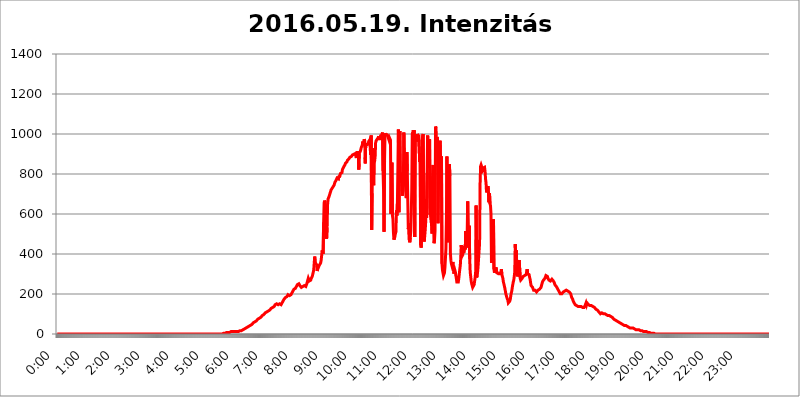
| Category | 2016.05.19. Intenzitás [W/m^2] |
|---|---|
| 0.0 | 0 |
| 0.0006944444444444445 | 0 |
| 0.001388888888888889 | 0 |
| 0.0020833333333333333 | 0 |
| 0.002777777777777778 | 0 |
| 0.003472222222222222 | 0 |
| 0.004166666666666667 | 0 |
| 0.004861111111111111 | 0 |
| 0.005555555555555556 | 0 |
| 0.0062499999999999995 | 0 |
| 0.006944444444444444 | 0 |
| 0.007638888888888889 | 0 |
| 0.008333333333333333 | 0 |
| 0.009027777777777779 | 0 |
| 0.009722222222222222 | 0 |
| 0.010416666666666666 | 0 |
| 0.011111111111111112 | 0 |
| 0.011805555555555555 | 0 |
| 0.012499999999999999 | 0 |
| 0.013194444444444444 | 0 |
| 0.013888888888888888 | 0 |
| 0.014583333333333332 | 0 |
| 0.015277777777777777 | 0 |
| 0.015972222222222224 | 0 |
| 0.016666666666666666 | 0 |
| 0.017361111111111112 | 0 |
| 0.018055555555555557 | 0 |
| 0.01875 | 0 |
| 0.019444444444444445 | 0 |
| 0.02013888888888889 | 0 |
| 0.020833333333333332 | 0 |
| 0.02152777777777778 | 0 |
| 0.022222222222222223 | 0 |
| 0.02291666666666667 | 0 |
| 0.02361111111111111 | 0 |
| 0.024305555555555556 | 0 |
| 0.024999999999999998 | 0 |
| 0.025694444444444447 | 0 |
| 0.02638888888888889 | 0 |
| 0.027083333333333334 | 0 |
| 0.027777777777777776 | 0 |
| 0.02847222222222222 | 0 |
| 0.029166666666666664 | 0 |
| 0.029861111111111113 | 0 |
| 0.030555555555555555 | 0 |
| 0.03125 | 0 |
| 0.03194444444444445 | 0 |
| 0.03263888888888889 | 0 |
| 0.03333333333333333 | 0 |
| 0.034027777777777775 | 0 |
| 0.034722222222222224 | 0 |
| 0.035416666666666666 | 0 |
| 0.036111111111111115 | 0 |
| 0.03680555555555556 | 0 |
| 0.0375 | 0 |
| 0.03819444444444444 | 0 |
| 0.03888888888888889 | 0 |
| 0.03958333333333333 | 0 |
| 0.04027777777777778 | 0 |
| 0.04097222222222222 | 0 |
| 0.041666666666666664 | 0 |
| 0.042361111111111106 | 0 |
| 0.04305555555555556 | 0 |
| 0.043750000000000004 | 0 |
| 0.044444444444444446 | 0 |
| 0.04513888888888889 | 0 |
| 0.04583333333333334 | 0 |
| 0.04652777777777778 | 0 |
| 0.04722222222222222 | 0 |
| 0.04791666666666666 | 0 |
| 0.04861111111111111 | 0 |
| 0.049305555555555554 | 0 |
| 0.049999999999999996 | 0 |
| 0.05069444444444445 | 0 |
| 0.051388888888888894 | 0 |
| 0.052083333333333336 | 0 |
| 0.05277777777777778 | 0 |
| 0.05347222222222222 | 0 |
| 0.05416666666666667 | 0 |
| 0.05486111111111111 | 0 |
| 0.05555555555555555 | 0 |
| 0.05625 | 0 |
| 0.05694444444444444 | 0 |
| 0.057638888888888885 | 0 |
| 0.05833333333333333 | 0 |
| 0.05902777777777778 | 0 |
| 0.059722222222222225 | 0 |
| 0.06041666666666667 | 0 |
| 0.061111111111111116 | 0 |
| 0.06180555555555556 | 0 |
| 0.0625 | 0 |
| 0.06319444444444444 | 0 |
| 0.06388888888888888 | 0 |
| 0.06458333333333334 | 0 |
| 0.06527777777777778 | 0 |
| 0.06597222222222222 | 0 |
| 0.06666666666666667 | 0 |
| 0.06736111111111111 | 0 |
| 0.06805555555555555 | 0 |
| 0.06874999999999999 | 0 |
| 0.06944444444444443 | 0 |
| 0.07013888888888889 | 0 |
| 0.07083333333333333 | 0 |
| 0.07152777777777779 | 0 |
| 0.07222222222222223 | 0 |
| 0.07291666666666667 | 0 |
| 0.07361111111111111 | 0 |
| 0.07430555555555556 | 0 |
| 0.075 | 0 |
| 0.07569444444444444 | 0 |
| 0.0763888888888889 | 0 |
| 0.07708333333333334 | 0 |
| 0.07777777777777778 | 0 |
| 0.07847222222222222 | 0 |
| 0.07916666666666666 | 0 |
| 0.0798611111111111 | 0 |
| 0.08055555555555556 | 0 |
| 0.08125 | 0 |
| 0.08194444444444444 | 0 |
| 0.08263888888888889 | 0 |
| 0.08333333333333333 | 0 |
| 0.08402777777777777 | 0 |
| 0.08472222222222221 | 0 |
| 0.08541666666666665 | 0 |
| 0.08611111111111112 | 0 |
| 0.08680555555555557 | 0 |
| 0.08750000000000001 | 0 |
| 0.08819444444444445 | 0 |
| 0.08888888888888889 | 0 |
| 0.08958333333333333 | 0 |
| 0.09027777777777778 | 0 |
| 0.09097222222222222 | 0 |
| 0.09166666666666667 | 0 |
| 0.09236111111111112 | 0 |
| 0.09305555555555556 | 0 |
| 0.09375 | 0 |
| 0.09444444444444444 | 0 |
| 0.09513888888888888 | 0 |
| 0.09583333333333333 | 0 |
| 0.09652777777777777 | 0 |
| 0.09722222222222222 | 0 |
| 0.09791666666666667 | 0 |
| 0.09861111111111111 | 0 |
| 0.09930555555555555 | 0 |
| 0.09999999999999999 | 0 |
| 0.10069444444444443 | 0 |
| 0.1013888888888889 | 0 |
| 0.10208333333333335 | 0 |
| 0.10277777777777779 | 0 |
| 0.10347222222222223 | 0 |
| 0.10416666666666667 | 0 |
| 0.10486111111111111 | 0 |
| 0.10555555555555556 | 0 |
| 0.10625 | 0 |
| 0.10694444444444444 | 0 |
| 0.1076388888888889 | 0 |
| 0.10833333333333334 | 0 |
| 0.10902777777777778 | 0 |
| 0.10972222222222222 | 0 |
| 0.1111111111111111 | 0 |
| 0.11180555555555556 | 0 |
| 0.11180555555555556 | 0 |
| 0.1125 | 0 |
| 0.11319444444444444 | 0 |
| 0.11388888888888889 | 0 |
| 0.11458333333333333 | 0 |
| 0.11527777777777777 | 0 |
| 0.11597222222222221 | 0 |
| 0.11666666666666665 | 0 |
| 0.1173611111111111 | 0 |
| 0.11805555555555557 | 0 |
| 0.11944444444444445 | 0 |
| 0.12013888888888889 | 0 |
| 0.12083333333333333 | 0 |
| 0.12152777777777778 | 0 |
| 0.12222222222222223 | 0 |
| 0.12291666666666667 | 0 |
| 0.12291666666666667 | 0 |
| 0.12361111111111112 | 0 |
| 0.12430555555555556 | 0 |
| 0.125 | 0 |
| 0.12569444444444444 | 0 |
| 0.12638888888888888 | 0 |
| 0.12708333333333333 | 0 |
| 0.16875 | 0 |
| 0.12847222222222224 | 0 |
| 0.12916666666666668 | 0 |
| 0.12986111111111112 | 0 |
| 0.13055555555555556 | 0 |
| 0.13125 | 0 |
| 0.13194444444444445 | 0 |
| 0.1326388888888889 | 0 |
| 0.13333333333333333 | 0 |
| 0.13402777777777777 | 0 |
| 0.13402777777777777 | 0 |
| 0.13472222222222222 | 0 |
| 0.13541666666666666 | 0 |
| 0.1361111111111111 | 0 |
| 0.13749999999999998 | 0 |
| 0.13819444444444443 | 0 |
| 0.1388888888888889 | 0 |
| 0.13958333333333334 | 0 |
| 0.14027777777777778 | 0 |
| 0.14097222222222222 | 0 |
| 0.14166666666666666 | 0 |
| 0.1423611111111111 | 0 |
| 0.14305555555555557 | 0 |
| 0.14375000000000002 | 0 |
| 0.14444444444444446 | 0 |
| 0.1451388888888889 | 0 |
| 0.1451388888888889 | 0 |
| 0.14652777777777778 | 0 |
| 0.14722222222222223 | 0 |
| 0.14791666666666667 | 0 |
| 0.1486111111111111 | 0 |
| 0.14930555555555555 | 0 |
| 0.15 | 0 |
| 0.15069444444444444 | 0 |
| 0.15138888888888888 | 0 |
| 0.15208333333333332 | 0 |
| 0.15277777777777776 | 0 |
| 0.15347222222222223 | 0 |
| 0.15416666666666667 | 0 |
| 0.15486111111111112 | 0 |
| 0.15555555555555556 | 0 |
| 0.15625 | 0 |
| 0.15694444444444444 | 0 |
| 0.15763888888888888 | 0 |
| 0.15833333333333333 | 0 |
| 0.15902777777777777 | 0 |
| 0.15972222222222224 | 0 |
| 0.16041666666666668 | 0 |
| 0.16111111111111112 | 0 |
| 0.16180555555555556 | 0 |
| 0.1625 | 0 |
| 0.16319444444444445 | 0 |
| 0.1638888888888889 | 0 |
| 0.16458333333333333 | 0 |
| 0.16527777777777777 | 0 |
| 0.16597222222222222 | 0 |
| 0.16666666666666666 | 0 |
| 0.1673611111111111 | 0 |
| 0.16805555555555554 | 0 |
| 0.16874999999999998 | 0 |
| 0.16944444444444443 | 0 |
| 0.17013888888888887 | 0 |
| 0.1708333333333333 | 0 |
| 0.17152777777777775 | 0 |
| 0.17222222222222225 | 0 |
| 0.1729166666666667 | 0 |
| 0.17361111111111113 | 0 |
| 0.17430555555555557 | 0 |
| 0.17500000000000002 | 0 |
| 0.17569444444444446 | 0 |
| 0.1763888888888889 | 0 |
| 0.17708333333333334 | 0 |
| 0.17777777777777778 | 0 |
| 0.17847222222222223 | 0 |
| 0.17916666666666667 | 0 |
| 0.1798611111111111 | 0 |
| 0.18055555555555555 | 0 |
| 0.18125 | 0 |
| 0.18194444444444444 | 0 |
| 0.1826388888888889 | 0 |
| 0.18333333333333335 | 0 |
| 0.1840277777777778 | 0 |
| 0.18472222222222223 | 0 |
| 0.18541666666666667 | 0 |
| 0.18611111111111112 | 0 |
| 0.18680555555555556 | 0 |
| 0.1875 | 0 |
| 0.18819444444444444 | 0 |
| 0.18888888888888888 | 0 |
| 0.18958333333333333 | 0 |
| 0.19027777777777777 | 0 |
| 0.1909722222222222 | 0 |
| 0.19166666666666665 | 0 |
| 0.19236111111111112 | 0 |
| 0.19305555555555554 | 0 |
| 0.19375 | 0 |
| 0.19444444444444445 | 0 |
| 0.1951388888888889 | 0 |
| 0.19583333333333333 | 0 |
| 0.19652777777777777 | 0 |
| 0.19722222222222222 | 0 |
| 0.19791666666666666 | 0 |
| 0.1986111111111111 | 0 |
| 0.19930555555555554 | 0 |
| 0.19999999999999998 | 0 |
| 0.20069444444444443 | 0 |
| 0.20138888888888887 | 0 |
| 0.2020833333333333 | 0 |
| 0.2027777777777778 | 0 |
| 0.2034722222222222 | 0 |
| 0.2041666666666667 | 0 |
| 0.20486111111111113 | 0 |
| 0.20555555555555557 | 0 |
| 0.20625000000000002 | 0 |
| 0.20694444444444446 | 0 |
| 0.2076388888888889 | 0 |
| 0.20833333333333334 | 0 |
| 0.20902777777777778 | 0 |
| 0.20972222222222223 | 0 |
| 0.21041666666666667 | 0 |
| 0.2111111111111111 | 0 |
| 0.21180555555555555 | 0 |
| 0.2125 | 0 |
| 0.21319444444444444 | 0 |
| 0.2138888888888889 | 0 |
| 0.21458333333333335 | 0 |
| 0.2152777777777778 | 0 |
| 0.21597222222222223 | 0 |
| 0.21666666666666667 | 0 |
| 0.21736111111111112 | 0 |
| 0.21805555555555556 | 0 |
| 0.21875 | 0 |
| 0.21944444444444444 | 0 |
| 0.22013888888888888 | 0 |
| 0.22083333333333333 | 0 |
| 0.22152777777777777 | 0 |
| 0.2222222222222222 | 0 |
| 0.22291666666666665 | 0 |
| 0.2236111111111111 | 0 |
| 0.22430555555555556 | 0 |
| 0.225 | 0 |
| 0.22569444444444445 | 0 |
| 0.2263888888888889 | 0 |
| 0.22708333333333333 | 0 |
| 0.22777777777777777 | 0 |
| 0.22847222222222222 | 0 |
| 0.22916666666666666 | 0 |
| 0.2298611111111111 | 0 |
| 0.23055555555555554 | 0 |
| 0.23124999999999998 | 0 |
| 0.23194444444444443 | 3.525 |
| 0.23263888888888887 | 3.525 |
| 0.2333333333333333 | 3.525 |
| 0.2340277777777778 | 3.525 |
| 0.2347222222222222 | 3.525 |
| 0.2354166666666667 | 3.525 |
| 0.23611111111111113 | 3.525 |
| 0.23680555555555557 | 3.525 |
| 0.23750000000000002 | 7.887 |
| 0.23819444444444446 | 7.887 |
| 0.2388888888888889 | 7.887 |
| 0.23958333333333334 | 7.887 |
| 0.24027777777777778 | 7.887 |
| 0.24097222222222223 | 7.887 |
| 0.24166666666666667 | 7.887 |
| 0.2423611111111111 | 7.887 |
| 0.24305555555555555 | 7.887 |
| 0.24375 | 12.257 |
| 0.24444444444444446 | 12.257 |
| 0.24513888888888888 | 12.257 |
| 0.24583333333333335 | 12.257 |
| 0.2465277777777778 | 12.257 |
| 0.24722222222222223 | 12.257 |
| 0.24791666666666667 | 12.257 |
| 0.24861111111111112 | 12.257 |
| 0.24930555555555556 | 12.257 |
| 0.25 | 12.257 |
| 0.25069444444444444 | 12.257 |
| 0.2513888888888889 | 12.257 |
| 0.2520833333333333 | 12.257 |
| 0.25277777777777777 | 12.257 |
| 0.2534722222222222 | 12.257 |
| 0.25416666666666665 | 12.257 |
| 0.2548611111111111 | 12.257 |
| 0.2555555555555556 | 12.257 |
| 0.25625000000000003 | 16.636 |
| 0.2569444444444445 | 16.636 |
| 0.2576388888888889 | 16.636 |
| 0.25833333333333336 | 16.636 |
| 0.2590277777777778 | 21.024 |
| 0.25972222222222224 | 21.024 |
| 0.2604166666666667 | 21.024 |
| 0.2611111111111111 | 21.024 |
| 0.26180555555555557 | 25.419 |
| 0.2625 | 25.419 |
| 0.26319444444444445 | 25.419 |
| 0.2638888888888889 | 29.823 |
| 0.26458333333333334 | 29.823 |
| 0.2652777777777778 | 29.823 |
| 0.2659722222222222 | 34.234 |
| 0.26666666666666666 | 34.234 |
| 0.2673611111111111 | 38.653 |
| 0.26805555555555555 | 38.653 |
| 0.26875 | 38.653 |
| 0.26944444444444443 | 38.653 |
| 0.2701388888888889 | 43.079 |
| 0.2708333333333333 | 43.079 |
| 0.27152777777777776 | 43.079 |
| 0.2722222222222222 | 47.511 |
| 0.27291666666666664 | 47.511 |
| 0.2736111111111111 | 51.951 |
| 0.2743055555555555 | 51.951 |
| 0.27499999999999997 | 56.398 |
| 0.27569444444444446 | 56.398 |
| 0.27638888888888885 | 60.85 |
| 0.27708333333333335 | 60.85 |
| 0.2777777777777778 | 65.31 |
| 0.27847222222222223 | 65.31 |
| 0.2791666666666667 | 65.31 |
| 0.2798611111111111 | 69.775 |
| 0.28055555555555556 | 69.775 |
| 0.28125 | 74.246 |
| 0.28194444444444444 | 74.246 |
| 0.2826388888888889 | 78.722 |
| 0.2833333333333333 | 78.722 |
| 0.28402777777777777 | 83.205 |
| 0.2847222222222222 | 83.205 |
| 0.28541666666666665 | 83.205 |
| 0.28611111111111115 | 87.692 |
| 0.28680555555555554 | 87.692 |
| 0.28750000000000003 | 92.184 |
| 0.2881944444444445 | 92.184 |
| 0.2888888888888889 | 92.184 |
| 0.28958333333333336 | 96.682 |
| 0.2902777777777778 | 101.184 |
| 0.29097222222222224 | 101.184 |
| 0.2916666666666667 | 105.69 |
| 0.2923611111111111 | 105.69 |
| 0.29305555555555557 | 110.201 |
| 0.29375 | 110.201 |
| 0.29444444444444445 | 114.716 |
| 0.2951388888888889 | 114.716 |
| 0.29583333333333334 | 114.716 |
| 0.2965277777777778 | 119.235 |
| 0.2972222222222222 | 119.235 |
| 0.29791666666666666 | 119.235 |
| 0.2986111111111111 | 123.758 |
| 0.29930555555555555 | 123.758 |
| 0.3 | 128.284 |
| 0.30069444444444443 | 128.284 |
| 0.3013888888888889 | 128.284 |
| 0.3020833333333333 | 132.814 |
| 0.30277777777777776 | 132.814 |
| 0.3034722222222222 | 137.347 |
| 0.30416666666666664 | 137.347 |
| 0.3048611111111111 | 141.884 |
| 0.3055555555555555 | 146.423 |
| 0.30624999999999997 | 146.423 |
| 0.3069444444444444 | 150.964 |
| 0.3076388888888889 | 150.964 |
| 0.30833333333333335 | 146.423 |
| 0.3090277777777778 | 146.423 |
| 0.30972222222222223 | 146.423 |
| 0.3104166666666667 | 146.423 |
| 0.3111111111111111 | 146.423 |
| 0.31180555555555556 | 150.964 |
| 0.3125 | 150.964 |
| 0.31319444444444444 | 146.423 |
| 0.3138888888888889 | 146.423 |
| 0.3145833333333333 | 150.964 |
| 0.31527777777777777 | 155.509 |
| 0.3159722222222222 | 160.056 |
| 0.31666666666666665 | 164.605 |
| 0.31736111111111115 | 169.156 |
| 0.31805555555555554 | 173.709 |
| 0.31875000000000003 | 173.709 |
| 0.3194444444444445 | 178.264 |
| 0.3201388888888889 | 182.82 |
| 0.32083333333333336 | 182.82 |
| 0.3215277777777778 | 182.82 |
| 0.32222222222222224 | 187.378 |
| 0.3229166666666667 | 191.937 |
| 0.3236111111111111 | 196.497 |
| 0.32430555555555557 | 196.497 |
| 0.325 | 196.497 |
| 0.32569444444444445 | 191.937 |
| 0.3263888888888889 | 191.937 |
| 0.32708333333333334 | 196.497 |
| 0.3277777777777778 | 196.497 |
| 0.3284722222222222 | 201.058 |
| 0.32916666666666666 | 205.62 |
| 0.3298611111111111 | 210.182 |
| 0.33055555555555555 | 214.746 |
| 0.33125 | 219.309 |
| 0.33194444444444443 | 223.873 |
| 0.3326388888888889 | 223.873 |
| 0.3333333333333333 | 228.436 |
| 0.3340277777777778 | 228.436 |
| 0.3347222222222222 | 233 |
| 0.3354166666666667 | 237.564 |
| 0.3361111111111111 | 242.127 |
| 0.3368055555555556 | 246.689 |
| 0.33749999999999997 | 246.689 |
| 0.33819444444444446 | 246.689 |
| 0.33888888888888885 | 251.251 |
| 0.33958333333333335 | 246.689 |
| 0.34027777777777773 | 242.127 |
| 0.34097222222222223 | 242.127 |
| 0.3416666666666666 | 237.564 |
| 0.3423611111111111 | 233 |
| 0.3430555555555555 | 233 |
| 0.34375 | 237.564 |
| 0.3444444444444445 | 237.564 |
| 0.3451388888888889 | 242.127 |
| 0.3458333333333334 | 242.127 |
| 0.34652777777777777 | 242.127 |
| 0.34722222222222227 | 237.564 |
| 0.34791666666666665 | 237.564 |
| 0.34861111111111115 | 237.564 |
| 0.34930555555555554 | 242.127 |
| 0.35000000000000003 | 251.251 |
| 0.3506944444444444 | 260.373 |
| 0.3513888888888889 | 269.49 |
| 0.3520833333333333 | 278.603 |
| 0.3527777777777778 | 274.047 |
| 0.3534722222222222 | 264.932 |
| 0.3541666666666667 | 264.932 |
| 0.3548611111111111 | 264.932 |
| 0.35555555555555557 | 269.49 |
| 0.35625 | 278.603 |
| 0.35694444444444445 | 283.156 |
| 0.3576388888888889 | 287.709 |
| 0.35833333333333334 | 287.709 |
| 0.3590277777777778 | 292.259 |
| 0.3597222222222222 | 319.517 |
| 0.36041666666666666 | 355.712 |
| 0.3611111111111111 | 387.202 |
| 0.36180555555555555 | 355.712 |
| 0.3625 | 351.198 |
| 0.36319444444444443 | 351.198 |
| 0.3638888888888889 | 346.682 |
| 0.3645833333333333 | 314.98 |
| 0.3652777777777778 | 324.052 |
| 0.3659722222222222 | 324.052 |
| 0.3666666666666667 | 328.584 |
| 0.3673611111111111 | 342.162 |
| 0.3680555555555556 | 342.162 |
| 0.36874999999999997 | 346.682 |
| 0.36944444444444446 | 355.712 |
| 0.37013888888888885 | 369.23 |
| 0.37083333333333335 | 391.685 |
| 0.37152777777777773 | 418.492 |
| 0.37222222222222223 | 409.574 |
| 0.3729166666666666 | 400.638 |
| 0.3736111111111111 | 558.261 |
| 0.3743055555555555 | 654.791 |
| 0.375 | 667.123 |
| 0.3756944444444445 | 658.909 |
| 0.3763888888888889 | 583.779 |
| 0.3770833333333334 | 510.885 |
| 0.37777777777777777 | 475.972 |
| 0.37847222222222227 | 532.513 |
| 0.37916666666666665 | 646.537 |
| 0.37986111111111115 | 675.311 |
| 0.38055555555555554 | 675.311 |
| 0.38125000000000003 | 687.544 |
| 0.3819444444444444 | 695.666 |
| 0.3826388888888889 | 703.762 |
| 0.3833333333333333 | 711.832 |
| 0.3840277777777778 | 719.877 |
| 0.3847222222222222 | 723.889 |
| 0.3854166666666667 | 727.896 |
| 0.3861111111111111 | 731.896 |
| 0.38680555555555557 | 735.89 |
| 0.3875 | 735.89 |
| 0.38819444444444445 | 743.859 |
| 0.3888888888888889 | 751.803 |
| 0.38958333333333334 | 759.723 |
| 0.3902777777777778 | 763.674 |
| 0.3909722222222222 | 767.62 |
| 0.39166666666666666 | 771.559 |
| 0.3923611111111111 | 779.42 |
| 0.39305555555555555 | 783.342 |
| 0.39375 | 783.342 |
| 0.39444444444444443 | 775.492 |
| 0.3951388888888889 | 791.169 |
| 0.3958333333333333 | 783.342 |
| 0.3965277777777778 | 795.074 |
| 0.3972222222222222 | 802.868 |
| 0.3979166666666667 | 806.757 |
| 0.3986111111111111 | 806.757 |
| 0.3993055555555556 | 806.757 |
| 0.39999999999999997 | 822.26 |
| 0.40069444444444446 | 822.26 |
| 0.40138888888888885 | 826.123 |
| 0.40208333333333335 | 837.682 |
| 0.40277777777777773 | 841.526 |
| 0.40347222222222223 | 845.365 |
| 0.4041666666666666 | 853.029 |
| 0.4048611111111111 | 853.029 |
| 0.4055555555555555 | 853.029 |
| 0.40625 | 860.676 |
| 0.4069444444444445 | 868.305 |
| 0.4076388888888889 | 868.305 |
| 0.4083333333333334 | 872.114 |
| 0.40902777777777777 | 875.918 |
| 0.40972222222222227 | 875.918 |
| 0.41041666666666665 | 883.516 |
| 0.41111111111111115 | 883.516 |
| 0.41180555555555554 | 883.516 |
| 0.41250000000000003 | 887.309 |
| 0.4131944444444444 | 891.099 |
| 0.4138888888888889 | 894.885 |
| 0.4145833333333333 | 894.885 |
| 0.4152777777777778 | 894.885 |
| 0.4159722222222222 | 898.668 |
| 0.4166666666666667 | 894.885 |
| 0.4173611111111111 | 894.885 |
| 0.41805555555555557 | 902.447 |
| 0.41875 | 898.668 |
| 0.41944444444444445 | 879.719 |
| 0.4201388888888889 | 894.885 |
| 0.42083333333333334 | 913.766 |
| 0.4215277777777778 | 898.668 |
| 0.4222222222222222 | 913.766 |
| 0.42291666666666666 | 822.26 |
| 0.4236111111111111 | 902.447 |
| 0.42430555555555555 | 898.668 |
| 0.425 | 913.766 |
| 0.42569444444444443 | 921.298 |
| 0.4263888888888889 | 932.576 |
| 0.4270833333333333 | 932.576 |
| 0.4277777777777778 | 943.832 |
| 0.4284722222222222 | 962.555 |
| 0.4291666666666667 | 958.814 |
| 0.4298611111111111 | 943.832 |
| 0.4305555555555556 | 973.772 |
| 0.43124999999999997 | 966.295 |
| 0.43194444444444446 | 853.029 |
| 0.43263888888888885 | 947.58 |
| 0.43333333333333335 | 947.58 |
| 0.43402777777777773 | 951.327 |
| 0.43472222222222223 | 947.58 |
| 0.4354166666666666 | 947.58 |
| 0.4361111111111111 | 955.071 |
| 0.4368055555555555 | 962.555 |
| 0.4375 | 966.295 |
| 0.4381944444444445 | 970.034 |
| 0.4388888888888889 | 932.576 |
| 0.4395833333333334 | 894.885 |
| 0.44027777777777777 | 992.448 |
| 0.44097222222222227 | 519.555 |
| 0.44166666666666665 | 703.762 |
| 0.44236111111111115 | 928.819 |
| 0.44305555555555554 | 894.885 |
| 0.44375000000000003 | 743.859 |
| 0.4444444444444444 | 853.029 |
| 0.4451388888888889 | 864.493 |
| 0.4458333333333333 | 887.309 |
| 0.4465277777777778 | 955.071 |
| 0.4472222222222222 | 966.295 |
| 0.4479166666666667 | 962.555 |
| 0.4486111111111111 | 973.772 |
| 0.44930555555555557 | 977.508 |
| 0.45 | 981.244 |
| 0.45069444444444445 | 988.714 |
| 0.4513888888888889 | 970.034 |
| 0.45208333333333334 | 981.244 |
| 0.4527777777777778 | 970.034 |
| 0.4534722222222222 | 988.714 |
| 0.45416666666666666 | 996.182 |
| 0.4548611111111111 | 981.244 |
| 0.45555555555555555 | 999.916 |
| 0.45625 | 1007.383 |
| 0.45694444444444443 | 814.519 |
| 0.4576388888888889 | 723.889 |
| 0.4583333333333333 | 510.885 |
| 0.4590277777777778 | 864.493 |
| 0.4597222222222222 | 1003.65 |
| 0.4604166666666667 | 996.182 |
| 0.4611111111111111 | 999.916 |
| 0.4618055555555556 | 996.182 |
| 0.46249999999999997 | 996.182 |
| 0.46319444444444446 | 996.182 |
| 0.46388888888888885 | 984.98 |
| 0.46458333333333335 | 984.98 |
| 0.46527777777777773 | 970.034 |
| 0.46597222222222223 | 981.244 |
| 0.4666666666666666 | 977.508 |
| 0.4673611111111111 | 970.034 |
| 0.4680555555555555 | 600.661 |
| 0.46875 | 783.342 |
| 0.4694444444444445 | 856.855 |
| 0.4701388888888889 | 592.233 |
| 0.4708333333333334 | 575.299 |
| 0.47152777777777777 | 506.542 |
| 0.47222222222222227 | 471.582 |
| 0.47291666666666665 | 475.972 |
| 0.47361111111111115 | 489.108 |
| 0.47430555555555554 | 502.192 |
| 0.47500000000000003 | 510.885 |
| 0.4756944444444444 | 617.436 |
| 0.4763888888888889 | 592.233 |
| 0.4770833333333333 | 654.791 |
| 0.4777777777777778 | 833.834 |
| 0.4784722222222222 | 1022.323 |
| 0.4791666666666667 | 609.062 |
| 0.4798611111111111 | 966.295 |
| 0.48055555555555557 | 1014.852 |
| 0.48125 | 755.766 |
| 0.48194444444444445 | 806.757 |
| 0.4826388888888889 | 791.169 |
| 0.48333333333333334 | 739.877 |
| 0.4840277777777778 | 691.608 |
| 0.4847222222222222 | 687.544 |
| 0.48541666666666666 | 771.559 |
| 0.4861111111111111 | 1007.383 |
| 0.48680555555555555 | 875.918 |
| 0.4875 | 822.26 |
| 0.48819444444444443 | 763.674 |
| 0.4888888888888889 | 707.8 |
| 0.4895833333333333 | 679.395 |
| 0.4902777777777778 | 909.996 |
| 0.4909722222222222 | 814.519 |
| 0.4916666666666667 | 663.019 |
| 0.4923611111111111 | 523.88 |
| 0.4930555555555556 | 553.986 |
| 0.49374999999999997 | 471.582 |
| 0.49444444444444446 | 458.38 |
| 0.49513888888888885 | 480.356 |
| 0.49583333333333335 | 515.223 |
| 0.49652777777777773 | 600.661 |
| 0.49722222222222223 | 723.889 |
| 0.4979166666666666 | 999.916 |
| 0.4986111111111111 | 1007.383 |
| 0.4993055555555555 | 1018.587 |
| 0.5 | 1007.383 |
| 0.5006944444444444 | 1018.587 |
| 0.5013888888888889 | 484.735 |
| 0.5020833333333333 | 981.244 |
| 0.5027777777777778 | 984.98 |
| 0.5034722222222222 | 996.182 |
| 0.5041666666666667 | 962.555 |
| 0.5048611111111111 | 999.916 |
| 0.5055555555555555 | 999.916 |
| 0.50625 | 988.714 |
| 0.5069444444444444 | 996.182 |
| 0.5076388888888889 | 992.448 |
| 0.5083333333333333 | 860.676 |
| 0.5090277777777777 | 883.516 |
| 0.5097222222222222 | 445.129 |
| 0.5104166666666666 | 431.833 |
| 0.5111111111111112 | 497.836 |
| 0.5118055555555555 | 970.034 |
| 0.5125000000000001 | 992.448 |
| 0.5131944444444444 | 999.916 |
| 0.513888888888889 | 999.916 |
| 0.5145833333333333 | 462.786 |
| 0.5152777777777778 | 484.735 |
| 0.5159722222222222 | 515.223 |
| 0.5166666666666667 | 553.986 |
| 0.517361111111111 | 675.311 |
| 0.5180555555555556 | 579.542 |
| 0.5187499999999999 | 806.757 |
| 0.5194444444444445 | 992.448 |
| 0.5201388888888888 | 936.33 |
| 0.5208333333333334 | 894.885 |
| 0.5215277777777778 | 829.981 |
| 0.5222222222222223 | 973.772 |
| 0.5229166666666667 | 596.45 |
| 0.5236111111111111 | 604.864 |
| 0.5243055555555556 | 609.062 |
| 0.525 | 545.416 |
| 0.5256944444444445 | 502.192 |
| 0.5263888888888889 | 787.258 |
| 0.5270833333333333 | 845.365 |
| 0.5277777777777778 | 571.049 |
| 0.5284722222222222 | 453.968 |
| 0.5291666666666667 | 471.582 |
| 0.5298611111111111 | 515.223 |
| 0.5305555555555556 | 1037.277 |
| 0.53125 | 1029.798 |
| 0.5319444444444444 | 951.327 |
| 0.5326388888888889 | 984.98 |
| 0.5333333333333333 | 973.772 |
| 0.5340277777777778 | 553.986 |
| 0.5347222222222222 | 795.074 |
| 0.5354166666666667 | 940.082 |
| 0.5361111111111111 | 806.757 |
| 0.5368055555555555 | 966.295 |
| 0.5375 | 883.516 |
| 0.5381944444444444 | 829.981 |
| 0.5388888888888889 | 887.309 |
| 0.5395833333333333 | 351.198 |
| 0.5402777777777777 | 319.517 |
| 0.5409722222222222 | 305.898 |
| 0.5416666666666666 | 292.259 |
| 0.5423611111111112 | 296.808 |
| 0.5430555555555555 | 305.898 |
| 0.5437500000000001 | 333.113 |
| 0.5444444444444444 | 378.224 |
| 0.545138888888889 | 427.39 |
| 0.5458333333333333 | 579.542 |
| 0.5465277777777778 | 887.309 |
| 0.5472222222222222 | 458.38 |
| 0.5479166666666667 | 549.704 |
| 0.548611111111111 | 489.108 |
| 0.5493055555555556 | 506.542 |
| 0.5499999999999999 | 849.199 |
| 0.5506944444444445 | 791.169 |
| 0.5513888888888888 | 405.108 |
| 0.5520833333333334 | 369.23 |
| 0.5527777777777778 | 351.198 |
| 0.5534722222222223 | 342.162 |
| 0.5541666666666667 | 342.162 |
| 0.5548611111111111 | 360.221 |
| 0.5555555555555556 | 328.584 |
| 0.55625 | 301.354 |
| 0.5569444444444445 | 310.44 |
| 0.5576388888888889 | 319.517 |
| 0.5583333333333333 | 310.44 |
| 0.5590277777777778 | 292.259 |
| 0.5597222222222222 | 278.603 |
| 0.5604166666666667 | 260.373 |
| 0.5611111111111111 | 255.813 |
| 0.5618055555555556 | 255.813 |
| 0.5625 | 260.373 |
| 0.5631944444444444 | 278.603 |
| 0.5638888888888889 | 301.354 |
| 0.5645833333333333 | 324.052 |
| 0.5652777777777778 | 342.162 |
| 0.5659722222222222 | 382.715 |
| 0.5666666666666667 | 445.129 |
| 0.5673611111111111 | 387.202 |
| 0.5680555555555555 | 387.202 |
| 0.56875 | 396.164 |
| 0.5694444444444444 | 414.035 |
| 0.5701388888888889 | 405.108 |
| 0.5708333333333333 | 409.574 |
| 0.5715277777777777 | 440.702 |
| 0.5722222222222222 | 422.943 |
| 0.5729166666666666 | 515.223 |
| 0.5736111111111112 | 431.833 |
| 0.5743055555555555 | 458.38 |
| 0.5750000000000001 | 515.223 |
| 0.5756944444444444 | 663.019 |
| 0.576388888888889 | 497.836 |
| 0.5770833333333333 | 453.968 |
| 0.5777777777777778 | 541.121 |
| 0.5784722222222222 | 373.729 |
| 0.5791666666666667 | 310.44 |
| 0.579861111111111 | 287.709 |
| 0.5805555555555556 | 264.932 |
| 0.5812499999999999 | 251.251 |
| 0.5819444444444445 | 242.127 |
| 0.5826388888888888 | 233 |
| 0.5833333333333334 | 228.436 |
| 0.5840277777777778 | 233 |
| 0.5847222222222223 | 246.689 |
| 0.5854166666666667 | 264.932 |
| 0.5861111111111111 | 283.156 |
| 0.5868055555555556 | 310.44 |
| 0.5875 | 642.4 |
| 0.5881944444444445 | 283.156 |
| 0.5888888888888889 | 292.259 |
| 0.5895833333333333 | 310.44 |
| 0.5902777777777778 | 342.162 |
| 0.5909722222222222 | 378.224 |
| 0.5916666666666667 | 418.492 |
| 0.5923611111111111 | 453.968 |
| 0.5930555555555556 | 751.803 |
| 0.59375 | 837.682 |
| 0.5944444444444444 | 845.365 |
| 0.5951388888888889 | 837.682 |
| 0.5958333333333333 | 829.981 |
| 0.5965277777777778 | 822.26 |
| 0.5972222222222222 | 829.981 |
| 0.5979166666666667 | 833.834 |
| 0.5986111111111111 | 826.123 |
| 0.5993055555555555 | 833.834 |
| 0.6 | 814.519 |
| 0.6006944444444444 | 775.492 |
| 0.6013888888888889 | 755.766 |
| 0.6020833333333333 | 707.8 |
| 0.6027777777777777 | 707.8 |
| 0.6034722222222222 | 727.896 |
| 0.6041666666666666 | 739.877 |
| 0.6048611111111112 | 743.859 |
| 0.6055555555555555 | 658.909 |
| 0.6062500000000001 | 703.762 |
| 0.6069444444444444 | 650.667 |
| 0.607638888888889 | 642.4 |
| 0.6083333333333333 | 600.661 |
| 0.6090277777777778 | 355.712 |
| 0.6097222222222222 | 493.475 |
| 0.6104166666666667 | 489.108 |
| 0.611111111111111 | 449.551 |
| 0.6118055555555556 | 575.299 |
| 0.6124999999999999 | 324.052 |
| 0.6131944444444445 | 305.898 |
| 0.6138888888888888 | 305.898 |
| 0.6145833333333334 | 310.44 |
| 0.6152777777777778 | 333.113 |
| 0.6159722222222223 | 337.639 |
| 0.6166666666666667 | 305.898 |
| 0.6173611111111111 | 301.354 |
| 0.6180555555555556 | 301.354 |
| 0.61875 | 301.354 |
| 0.6194444444444445 | 296.808 |
| 0.6201388888888889 | 296.808 |
| 0.6208333333333333 | 301.354 |
| 0.6215277777777778 | 301.354 |
| 0.6222222222222222 | 310.44 |
| 0.6229166666666667 | 324.052 |
| 0.6236111111111111 | 296.808 |
| 0.6243055555555556 | 292.259 |
| 0.625 | 278.603 |
| 0.6256944444444444 | 260.373 |
| 0.6263888888888889 | 251.251 |
| 0.6270833333333333 | 251.251 |
| 0.6277777777777778 | 228.436 |
| 0.6284722222222222 | 214.746 |
| 0.6291666666666667 | 201.058 |
| 0.6298611111111111 | 191.937 |
| 0.6305555555555555 | 182.82 |
| 0.63125 | 178.264 |
| 0.6319444444444444 | 169.156 |
| 0.6326388888888889 | 155.509 |
| 0.6333333333333333 | 150.964 |
| 0.6340277777777777 | 155.509 |
| 0.6347222222222222 | 164.605 |
| 0.6354166666666666 | 173.709 |
| 0.6361111111111112 | 191.937 |
| 0.6368055555555555 | 205.62 |
| 0.6375000000000001 | 214.746 |
| 0.6381944444444444 | 233 |
| 0.638888888888889 | 246.689 |
| 0.6395833333333333 | 260.373 |
| 0.6402777777777778 | 269.49 |
| 0.6409722222222222 | 287.709 |
| 0.6416666666666667 | 310.44 |
| 0.642361111111111 | 449.551 |
| 0.6430555555555556 | 378.224 |
| 0.6437499999999999 | 418.492 |
| 0.6444444444444445 | 418.492 |
| 0.6451388888888888 | 296.808 |
| 0.6458333333333334 | 287.709 |
| 0.6465277777777778 | 301.354 |
| 0.6472222222222223 | 342.162 |
| 0.6479166666666667 | 369.23 |
| 0.6486111111111111 | 373.729 |
| 0.6493055555555556 | 278.603 |
| 0.65 | 269.49 |
| 0.6506944444444445 | 269.49 |
| 0.6513888888888889 | 269.49 |
| 0.6520833333333333 | 278.603 |
| 0.6527777777777778 | 283.156 |
| 0.6534722222222222 | 287.709 |
| 0.6541666666666667 | 292.259 |
| 0.6548611111111111 | 292.259 |
| 0.6555555555555556 | 292.259 |
| 0.65625 | 287.709 |
| 0.6569444444444444 | 287.709 |
| 0.6576388888888889 | 296.808 |
| 0.6583333333333333 | 310.44 |
| 0.6590277777777778 | 324.052 |
| 0.6597222222222222 | 301.354 |
| 0.6604166666666667 | 301.354 |
| 0.6611111111111111 | 296.808 |
| 0.6618055555555555 | 296.808 |
| 0.6625 | 283.156 |
| 0.6631944444444444 | 274.047 |
| 0.6638888888888889 | 255.813 |
| 0.6645833333333333 | 242.127 |
| 0.6652777777777777 | 237.564 |
| 0.6659722222222222 | 237.564 |
| 0.6666666666666666 | 233 |
| 0.6673611111111111 | 228.436 |
| 0.6680555555555556 | 219.309 |
| 0.6687500000000001 | 219.309 |
| 0.6694444444444444 | 219.309 |
| 0.6701388888888888 | 219.309 |
| 0.6708333333333334 | 214.746 |
| 0.6715277777777778 | 214.746 |
| 0.6722222222222222 | 210.182 |
| 0.6729166666666666 | 214.746 |
| 0.6736111111111112 | 214.746 |
| 0.6743055555555556 | 219.309 |
| 0.6749999999999999 | 223.873 |
| 0.6756944444444444 | 223.873 |
| 0.6763888888888889 | 223.873 |
| 0.6770833333333334 | 223.873 |
| 0.6777777777777777 | 228.436 |
| 0.6784722222222223 | 233 |
| 0.6791666666666667 | 242.127 |
| 0.6798611111111111 | 251.251 |
| 0.6805555555555555 | 260.373 |
| 0.68125 | 264.932 |
| 0.6819444444444445 | 269.49 |
| 0.6826388888888889 | 269.49 |
| 0.6833333333333332 | 274.047 |
| 0.6840277777777778 | 278.603 |
| 0.6847222222222222 | 283.156 |
| 0.6854166666666667 | 292.259 |
| 0.686111111111111 | 296.808 |
| 0.6868055555555556 | 292.259 |
| 0.6875 | 287.709 |
| 0.6881944444444444 | 278.603 |
| 0.688888888888889 | 274.047 |
| 0.6895833333333333 | 269.49 |
| 0.6902777777777778 | 269.49 |
| 0.6909722222222222 | 264.932 |
| 0.6916666666666668 | 264.932 |
| 0.6923611111111111 | 269.49 |
| 0.6930555555555555 | 264.932 |
| 0.69375 | 274.047 |
| 0.6944444444444445 | 269.49 |
| 0.6951388888888889 | 269.49 |
| 0.6958333333333333 | 264.932 |
| 0.6965277777777777 | 264.932 |
| 0.6972222222222223 | 255.813 |
| 0.6979166666666666 | 246.689 |
| 0.6986111111111111 | 242.127 |
| 0.6993055555555556 | 242.127 |
| 0.7000000000000001 | 237.564 |
| 0.7006944444444444 | 233 |
| 0.7013888888888888 | 228.436 |
| 0.7020833333333334 | 223.873 |
| 0.7027777777777778 | 219.309 |
| 0.7034722222222222 | 214.746 |
| 0.7041666666666666 | 210.182 |
| 0.7048611111111112 | 205.62 |
| 0.7055555555555556 | 201.058 |
| 0.7062499999999999 | 201.058 |
| 0.7069444444444444 | 201.058 |
| 0.7076388888888889 | 201.058 |
| 0.7083333333333334 | 201.058 |
| 0.7090277777777777 | 205.62 |
| 0.7097222222222223 | 210.182 |
| 0.7104166666666667 | 210.182 |
| 0.7111111111111111 | 210.182 |
| 0.7118055555555555 | 214.746 |
| 0.7125 | 214.746 |
| 0.7131944444444445 | 214.746 |
| 0.7138888888888889 | 219.309 |
| 0.7145833333333332 | 214.746 |
| 0.7152777777777778 | 214.746 |
| 0.7159722222222222 | 214.746 |
| 0.7166666666666667 | 214.746 |
| 0.717361111111111 | 210.182 |
| 0.7180555555555556 | 210.182 |
| 0.71875 | 210.182 |
| 0.7194444444444444 | 205.62 |
| 0.720138888888889 | 201.058 |
| 0.7208333333333333 | 191.937 |
| 0.7215277777777778 | 182.82 |
| 0.7222222222222222 | 178.264 |
| 0.7229166666666668 | 173.709 |
| 0.7236111111111111 | 164.605 |
| 0.7243055555555555 | 164.605 |
| 0.725 | 155.509 |
| 0.7256944444444445 | 150.964 |
| 0.7263888888888889 | 146.423 |
| 0.7270833333333333 | 146.423 |
| 0.7277777777777777 | 141.884 |
| 0.7284722222222223 | 141.884 |
| 0.7291666666666666 | 137.347 |
| 0.7298611111111111 | 137.347 |
| 0.7305555555555556 | 137.347 |
| 0.7312500000000001 | 137.347 |
| 0.7319444444444444 | 137.347 |
| 0.7326388888888888 | 137.347 |
| 0.7333333333333334 | 137.347 |
| 0.7340277777777778 | 137.347 |
| 0.7347222222222222 | 137.347 |
| 0.7354166666666666 | 137.347 |
| 0.7361111111111112 | 132.814 |
| 0.7368055555555556 | 132.814 |
| 0.7374999999999999 | 132.814 |
| 0.7381944444444444 | 132.814 |
| 0.7388888888888889 | 132.814 |
| 0.7395833333333334 | 137.347 |
| 0.7402777777777777 | 141.884 |
| 0.7409722222222223 | 146.423 |
| 0.7416666666666667 | 155.509 |
| 0.7423611111111111 | 146.423 |
| 0.7430555555555555 | 155.509 |
| 0.74375 | 150.964 |
| 0.7444444444444445 | 150.964 |
| 0.7451388888888889 | 146.423 |
| 0.7458333333333332 | 146.423 |
| 0.7465277777777778 | 141.884 |
| 0.7472222222222222 | 141.884 |
| 0.7479166666666667 | 141.884 |
| 0.748611111111111 | 141.884 |
| 0.7493055555555556 | 141.884 |
| 0.75 | 141.884 |
| 0.7506944444444444 | 141.884 |
| 0.751388888888889 | 137.347 |
| 0.7520833333333333 | 137.347 |
| 0.7527777777777778 | 132.814 |
| 0.7534722222222222 | 132.814 |
| 0.7541666666666668 | 128.284 |
| 0.7548611111111111 | 128.284 |
| 0.7555555555555555 | 123.758 |
| 0.75625 | 119.235 |
| 0.7569444444444445 | 119.235 |
| 0.7576388888888889 | 119.235 |
| 0.7583333333333333 | 114.716 |
| 0.7590277777777777 | 114.716 |
| 0.7597222222222223 | 110.201 |
| 0.7604166666666666 | 105.69 |
| 0.7611111111111111 | 105.69 |
| 0.7618055555555556 | 101.184 |
| 0.7625000000000001 | 101.184 |
| 0.7631944444444444 | 105.69 |
| 0.7638888888888888 | 105.69 |
| 0.7645833333333334 | 101.184 |
| 0.7652777777777778 | 101.184 |
| 0.7659722222222222 | 101.184 |
| 0.7666666666666666 | 101.184 |
| 0.7673611111111112 | 101.184 |
| 0.7680555555555556 | 101.184 |
| 0.7687499999999999 | 101.184 |
| 0.7694444444444444 | 101.184 |
| 0.7701388888888889 | 96.682 |
| 0.7708333333333334 | 96.682 |
| 0.7715277777777777 | 96.682 |
| 0.7722222222222223 | 92.184 |
| 0.7729166666666667 | 92.184 |
| 0.7736111111111111 | 92.184 |
| 0.7743055555555555 | 92.184 |
| 0.775 | 92.184 |
| 0.7756944444444445 | 92.184 |
| 0.7763888888888889 | 87.692 |
| 0.7770833333333332 | 87.692 |
| 0.7777777777777778 | 87.692 |
| 0.7784722222222222 | 83.205 |
| 0.7791666666666667 | 78.722 |
| 0.779861111111111 | 78.722 |
| 0.7805555555555556 | 74.246 |
| 0.78125 | 74.246 |
| 0.7819444444444444 | 69.775 |
| 0.782638888888889 | 69.775 |
| 0.7833333333333333 | 69.775 |
| 0.7840277777777778 | 65.31 |
| 0.7847222222222222 | 65.31 |
| 0.7854166666666668 | 65.31 |
| 0.7861111111111111 | 60.85 |
| 0.7868055555555555 | 60.85 |
| 0.7875 | 60.85 |
| 0.7881944444444445 | 56.398 |
| 0.7888888888888889 | 56.398 |
| 0.7895833333333333 | 51.951 |
| 0.7902777777777777 | 51.951 |
| 0.7909722222222223 | 51.951 |
| 0.7916666666666666 | 47.511 |
| 0.7923611111111111 | 47.511 |
| 0.7930555555555556 | 47.511 |
| 0.7937500000000001 | 47.511 |
| 0.7944444444444444 | 43.079 |
| 0.7951388888888888 | 43.079 |
| 0.7958333333333334 | 43.079 |
| 0.7965277777777778 | 43.079 |
| 0.7972222222222222 | 43.079 |
| 0.7979166666666666 | 38.653 |
| 0.7986111111111112 | 38.653 |
| 0.7993055555555556 | 38.653 |
| 0.7999999999999999 | 38.653 |
| 0.8006944444444444 | 34.234 |
| 0.8013888888888889 | 34.234 |
| 0.8020833333333334 | 34.234 |
| 0.8027777777777777 | 34.234 |
| 0.8034722222222223 | 29.823 |
| 0.8041666666666667 | 29.823 |
| 0.8048611111111111 | 29.823 |
| 0.8055555555555555 | 29.823 |
| 0.80625 | 29.823 |
| 0.8069444444444445 | 29.823 |
| 0.8076388888888889 | 29.823 |
| 0.8083333333333332 | 29.823 |
| 0.8090277777777778 | 25.419 |
| 0.8097222222222222 | 25.419 |
| 0.8104166666666667 | 25.419 |
| 0.811111111111111 | 25.419 |
| 0.8118055555555556 | 21.024 |
| 0.8125 | 21.024 |
| 0.8131944444444444 | 21.024 |
| 0.813888888888889 | 21.024 |
| 0.8145833333333333 | 21.024 |
| 0.8152777777777778 | 21.024 |
| 0.8159722222222222 | 21.024 |
| 0.8166666666666668 | 21.024 |
| 0.8173611111111111 | 16.636 |
| 0.8180555555555555 | 16.636 |
| 0.81875 | 16.636 |
| 0.8194444444444445 | 16.636 |
| 0.8201388888888889 | 16.636 |
| 0.8208333333333333 | 16.636 |
| 0.8215277777777777 | 16.636 |
| 0.8222222222222223 | 12.257 |
| 0.8229166666666666 | 12.257 |
| 0.8236111111111111 | 12.257 |
| 0.8243055555555556 | 12.257 |
| 0.8250000000000001 | 12.257 |
| 0.8256944444444444 | 12.257 |
| 0.8263888888888888 | 12.257 |
| 0.8270833333333334 | 12.257 |
| 0.8277777777777778 | 7.887 |
| 0.8284722222222222 | 7.887 |
| 0.8291666666666666 | 7.887 |
| 0.8298611111111112 | 7.887 |
| 0.8305555555555556 | 7.887 |
| 0.8312499999999999 | 7.887 |
| 0.8319444444444444 | 7.887 |
| 0.8326388888888889 | 3.525 |
| 0.8333333333333334 | 3.525 |
| 0.8340277777777777 | 3.525 |
| 0.8347222222222223 | 3.525 |
| 0.8354166666666667 | 3.525 |
| 0.8361111111111111 | 3.525 |
| 0.8368055555555555 | 3.525 |
| 0.8375 | 0 |
| 0.8381944444444445 | 0 |
| 0.8388888888888889 | 0 |
| 0.8395833333333332 | 0 |
| 0.8402777777777778 | 0 |
| 0.8409722222222222 | 0 |
| 0.8416666666666667 | 0 |
| 0.842361111111111 | 0 |
| 0.8430555555555556 | 0 |
| 0.84375 | 0 |
| 0.8444444444444444 | 0 |
| 0.845138888888889 | 0 |
| 0.8458333333333333 | 0 |
| 0.8465277777777778 | 0 |
| 0.8472222222222222 | 0 |
| 0.8479166666666668 | 0 |
| 0.8486111111111111 | 0 |
| 0.8493055555555555 | 0 |
| 0.85 | 0 |
| 0.8506944444444445 | 0 |
| 0.8513888888888889 | 0 |
| 0.8520833333333333 | 0 |
| 0.8527777777777777 | 0 |
| 0.8534722222222223 | 0 |
| 0.8541666666666666 | 0 |
| 0.8548611111111111 | 0 |
| 0.8555555555555556 | 0 |
| 0.8562500000000001 | 0 |
| 0.8569444444444444 | 0 |
| 0.8576388888888888 | 0 |
| 0.8583333333333334 | 0 |
| 0.8590277777777778 | 0 |
| 0.8597222222222222 | 0 |
| 0.8604166666666666 | 0 |
| 0.8611111111111112 | 0 |
| 0.8618055555555556 | 0 |
| 0.8624999999999999 | 0 |
| 0.8631944444444444 | 0 |
| 0.8638888888888889 | 0 |
| 0.8645833333333334 | 0 |
| 0.8652777777777777 | 0 |
| 0.8659722222222223 | 0 |
| 0.8666666666666667 | 0 |
| 0.8673611111111111 | 0 |
| 0.8680555555555555 | 0 |
| 0.86875 | 0 |
| 0.8694444444444445 | 0 |
| 0.8701388888888889 | 0 |
| 0.8708333333333332 | 0 |
| 0.8715277777777778 | 0 |
| 0.8722222222222222 | 0 |
| 0.8729166666666667 | 0 |
| 0.873611111111111 | 0 |
| 0.8743055555555556 | 0 |
| 0.875 | 0 |
| 0.8756944444444444 | 0 |
| 0.876388888888889 | 0 |
| 0.8770833333333333 | 0 |
| 0.8777777777777778 | 0 |
| 0.8784722222222222 | 0 |
| 0.8791666666666668 | 0 |
| 0.8798611111111111 | 0 |
| 0.8805555555555555 | 0 |
| 0.88125 | 0 |
| 0.8819444444444445 | 0 |
| 0.8826388888888889 | 0 |
| 0.8833333333333333 | 0 |
| 0.8840277777777777 | 0 |
| 0.8847222222222223 | 0 |
| 0.8854166666666666 | 0 |
| 0.8861111111111111 | 0 |
| 0.8868055555555556 | 0 |
| 0.8875000000000001 | 0 |
| 0.8881944444444444 | 0 |
| 0.8888888888888888 | 0 |
| 0.8895833333333334 | 0 |
| 0.8902777777777778 | 0 |
| 0.8909722222222222 | 0 |
| 0.8916666666666666 | 0 |
| 0.8923611111111112 | 0 |
| 0.8930555555555556 | 0 |
| 0.8937499999999999 | 0 |
| 0.8944444444444444 | 0 |
| 0.8951388888888889 | 0 |
| 0.8958333333333334 | 0 |
| 0.8965277777777777 | 0 |
| 0.8972222222222223 | 0 |
| 0.8979166666666667 | 0 |
| 0.8986111111111111 | 0 |
| 0.8993055555555555 | 0 |
| 0.9 | 0 |
| 0.9006944444444445 | 0 |
| 0.9013888888888889 | 0 |
| 0.9020833333333332 | 0 |
| 0.9027777777777778 | 0 |
| 0.9034722222222222 | 0 |
| 0.9041666666666667 | 0 |
| 0.904861111111111 | 0 |
| 0.9055555555555556 | 0 |
| 0.90625 | 0 |
| 0.9069444444444444 | 0 |
| 0.907638888888889 | 0 |
| 0.9083333333333333 | 0 |
| 0.9090277777777778 | 0 |
| 0.9097222222222222 | 0 |
| 0.9104166666666668 | 0 |
| 0.9111111111111111 | 0 |
| 0.9118055555555555 | 0 |
| 0.9125 | 0 |
| 0.9131944444444445 | 0 |
| 0.9138888888888889 | 0 |
| 0.9145833333333333 | 0 |
| 0.9152777777777777 | 0 |
| 0.9159722222222223 | 0 |
| 0.9166666666666666 | 0 |
| 0.9173611111111111 | 0 |
| 0.9180555555555556 | 0 |
| 0.9187500000000001 | 0 |
| 0.9194444444444444 | 0 |
| 0.9201388888888888 | 0 |
| 0.9208333333333334 | 0 |
| 0.9215277777777778 | 0 |
| 0.9222222222222222 | 0 |
| 0.9229166666666666 | 0 |
| 0.9236111111111112 | 0 |
| 0.9243055555555556 | 0 |
| 0.9249999999999999 | 0 |
| 0.9256944444444444 | 0 |
| 0.9263888888888889 | 0 |
| 0.9270833333333334 | 0 |
| 0.9277777777777777 | 0 |
| 0.9284722222222223 | 0 |
| 0.9291666666666667 | 0 |
| 0.9298611111111111 | 0 |
| 0.9305555555555555 | 0 |
| 0.93125 | 0 |
| 0.9319444444444445 | 0 |
| 0.9326388888888889 | 0 |
| 0.9333333333333332 | 0 |
| 0.9340277777777778 | 0 |
| 0.9347222222222222 | 0 |
| 0.9354166666666667 | 0 |
| 0.936111111111111 | 0 |
| 0.9368055555555556 | 0 |
| 0.9375 | 0 |
| 0.9381944444444444 | 0 |
| 0.938888888888889 | 0 |
| 0.9395833333333333 | 0 |
| 0.9402777777777778 | 0 |
| 0.9409722222222222 | 0 |
| 0.9416666666666668 | 0 |
| 0.9423611111111111 | 0 |
| 0.9430555555555555 | 0 |
| 0.94375 | 0 |
| 0.9444444444444445 | 0 |
| 0.9451388888888889 | 0 |
| 0.9458333333333333 | 0 |
| 0.9465277777777777 | 0 |
| 0.9472222222222223 | 0 |
| 0.9479166666666666 | 0 |
| 0.9486111111111111 | 0 |
| 0.9493055555555556 | 0 |
| 0.9500000000000001 | 0 |
| 0.9506944444444444 | 0 |
| 0.9513888888888888 | 0 |
| 0.9520833333333334 | 0 |
| 0.9527777777777778 | 0 |
| 0.9534722222222222 | 0 |
| 0.9541666666666666 | 0 |
| 0.9548611111111112 | 0 |
| 0.9555555555555556 | 0 |
| 0.9562499999999999 | 0 |
| 0.9569444444444444 | 0 |
| 0.9576388888888889 | 0 |
| 0.9583333333333334 | 0 |
| 0.9590277777777777 | 0 |
| 0.9597222222222223 | 0 |
| 0.9604166666666667 | 0 |
| 0.9611111111111111 | 0 |
| 0.9618055555555555 | 0 |
| 0.9625 | 0 |
| 0.9631944444444445 | 0 |
| 0.9638888888888889 | 0 |
| 0.9645833333333332 | 0 |
| 0.9652777777777778 | 0 |
| 0.9659722222222222 | 0 |
| 0.9666666666666667 | 0 |
| 0.967361111111111 | 0 |
| 0.9680555555555556 | 0 |
| 0.96875 | 0 |
| 0.9694444444444444 | 0 |
| 0.970138888888889 | 0 |
| 0.9708333333333333 | 0 |
| 0.9715277777777778 | 0 |
| 0.9722222222222222 | 0 |
| 0.9729166666666668 | 0 |
| 0.9736111111111111 | 0 |
| 0.9743055555555555 | 0 |
| 0.975 | 0 |
| 0.9756944444444445 | 0 |
| 0.9763888888888889 | 0 |
| 0.9770833333333333 | 0 |
| 0.9777777777777777 | 0 |
| 0.9784722222222223 | 0 |
| 0.9791666666666666 | 0 |
| 0.9798611111111111 | 0 |
| 0.9805555555555556 | 0 |
| 0.9812500000000001 | 0 |
| 0.9819444444444444 | 0 |
| 0.9826388888888888 | 0 |
| 0.9833333333333334 | 0 |
| 0.9840277777777778 | 0 |
| 0.9847222222222222 | 0 |
| 0.9854166666666666 | 0 |
| 0.9861111111111112 | 0 |
| 0.9868055555555556 | 0 |
| 0.9874999999999999 | 0 |
| 0.9881944444444444 | 0 |
| 0.9888888888888889 | 0 |
| 0.9895833333333334 | 0 |
| 0.9902777777777777 | 0 |
| 0.9909722222222223 | 0 |
| 0.9916666666666667 | 0 |
| 0.9923611111111111 | 0 |
| 0.9930555555555555 | 0 |
| 0.99375 | 0 |
| 0.9944444444444445 | 0 |
| 0.9951388888888889 | 0 |
| 0.9958333333333332 | 0 |
| 0.9965277777777778 | 0 |
| 0.9972222222222222 | 0 |
| 0.9979166666666667 | 0 |
| 0.998611111111111 | 0 |
| 0.9993055555555556 | 0 |